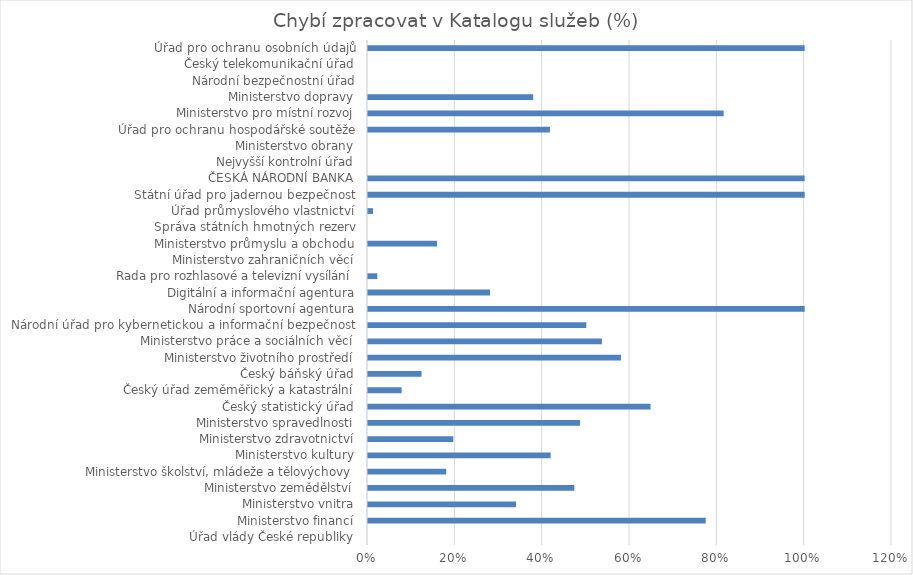
| Category | Chybí zpracovat v Katalogu služeb (%) |
|---|---|
| Úřad vlády České republiky | 0 |
| Ministerstvo financí | 0.773 |
| Ministerstvo vnitra | 0.339 |
| Ministerstvo zemědělství | 0.473 |
| Ministerstvo školství, mládeže a tělovýchovy | 0.179 |
| Ministerstvo kultury | 0.418 |
| Ministerstvo zdravotnictví | 0.195 |
| Ministerstvo spravedlnosti | 0.485 |
| Český statistický úřad | 0.647 |
| Český úřad zeměměřický a katastrální | 0.077 |
| Český báňský úřad | 0.123 |
| Ministerstvo životního prostředí | 0.579 |
| Ministerstvo práce a sociálních věcí | 0.536 |
| Národní úřad pro kybernetickou a informační bezpečnost | 0.5 |
| Národní sportovní agentura | 1 |
| Digitální a informační agentura | 0.28 |
| Rada pro rozhlasové a televizní vysílání | 0.021 |
| Ministerstvo zahraničních věcí | 0 |
| Ministerstvo průmyslu a obchodu | 0.158 |
| Správa státních hmotných rezerv | 0 |
| Úřad průmyslového vlastnictví | 0.012 |
| Státní úřad pro jadernou bezpečnost | 1 |
| ČESKÁ NÁRODNÍ BANKA | 1 |
| Nejvyšší kontrolní úřad | 0 |
| Ministerstvo obrany | 0 |
| Úřad pro ochranu hospodářské soutěže | 0.417 |
| Ministerstvo pro místní rozvoj | 0.814 |
| Ministerstvo dopravy | 0.378 |
| Národní bezpečnostní úřad | 0 |
| Český telekomunikační úřad | 0 |
| Úřad pro ochranu osobních údajů | 1 |